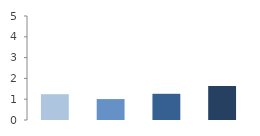
| Category | Rate (%) |
|---|---|
| 2009.0 | 1.24 |
| 2010.0 | 1.007 |
| 2011.0 | 1.26 |
| 2012.0 | 1.639 |